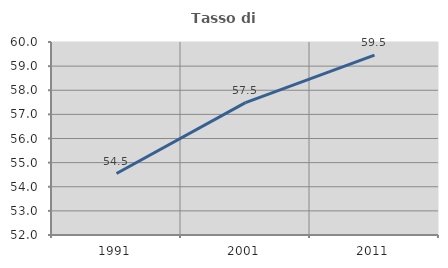
| Category | Tasso di occupazione   |
|---|---|
| 1991.0 | 54.547 |
| 2001.0 | 57.486 |
| 2011.0 | 59.457 |